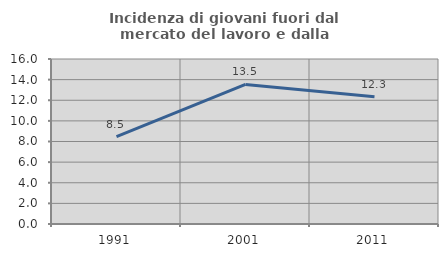
| Category | Incidenza di giovani fuori dal mercato del lavoro e dalla formazione  |
|---|---|
| 1991.0 | 8.483 |
| 2001.0 | 13.538 |
| 2011.0 | 12.34 |